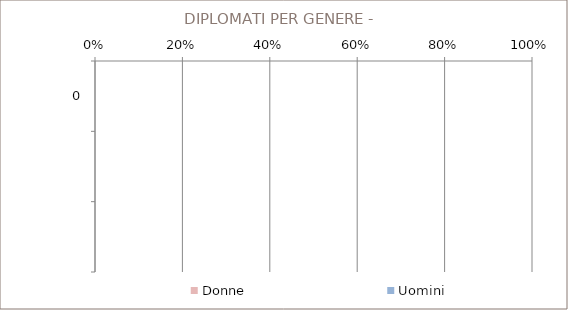
| Category | Donne | Uomini |
|---|---|---|
| 0 | 0 | 0 |